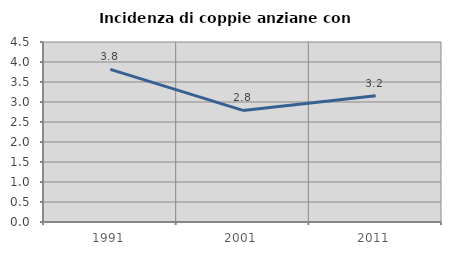
| Category | Incidenza di coppie anziane con figli |
|---|---|
| 1991.0 | 3.817 |
| 2001.0 | 2.79 |
| 2011.0 | 3.154 |